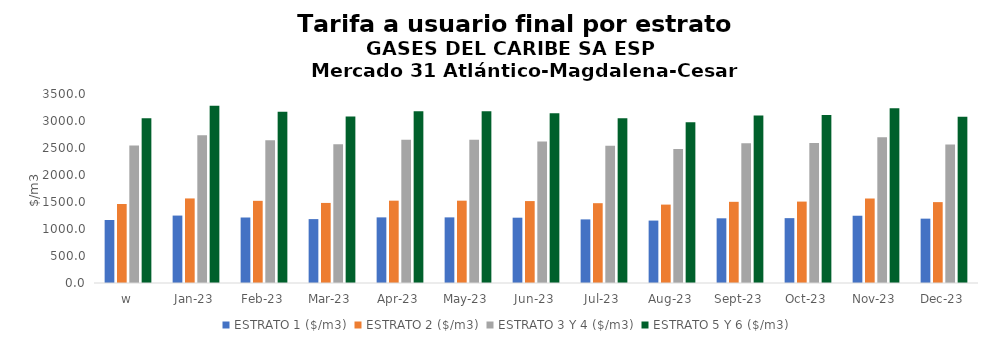
| Category | ESTRATO 1 ($/m3) | ESTRATO 2 ($/m3) | ESTRATO 3 Y 4 ($/m3) | ESTRATO 5 Y 6 ($/m3) |
|---|---|---|---|---|
| w | 1166.58 | 1463.43 | 2544.24 | 3053.088 |
| ene-23 | 1248.7 | 1565.89 | 2736.03 | 3283.236 |
| feb-23 | 1212.89 | 1521.57 | 2641.83 | 3170.196 |
| mar-23 | 1183.19 | 1482.78 | 2568.94 | 3082.728 |
| abr-23 | 1215.25 | 1524.46 | 2651.33 | 3181.596 |
| may-23 | 1215.25 | 1524.46 | 2651.33 | 3181.596 |
| jun-23 | 1209.41 | 1517.12 | 2619.03 | 3142.836 |
| jul-23 | 1178 | 1477.97 | 2542.18 | 3050.616 |
| ago-23 | 1155.93 | 1451.92 | 2479.28 | 2975.136 |
| sep-23 | 1198 | 1503.27 | 2586.8 | 3104.16 |
| oct-23 | 1201.13 | 1507.69 | 2594.42 | 3113.304 |
| nov-23 | 1245.69 | 1564.66 | 2697.24 | 3236.688 |
| dic-23 | 1191.7 | 1497.74 | 2567.03 | 3080.436 |